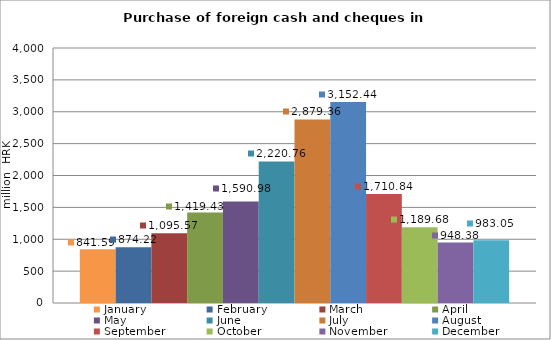
| Category | January | February | March | April | May | June | July | August | September | October | November | December |
|---|---|---|---|---|---|---|---|---|---|---|---|---|
| 0 | 841.588 | 874.22 | 1095.57 | 1419.43 | 1590.977 | 2220.761 | 2879.357 | 3152.444 | 1710.837 | 1189.684 | 948.384 | 983.045 |